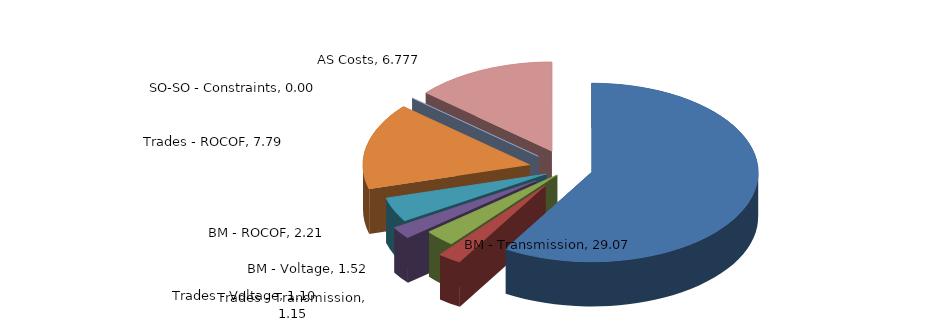
| Category | Series 0 |
|---|---|
| BM - Transmission | 29.065 |
| Trades - Transmission | 1.149 |
| BM - Voltage | 1.517 |
| Trades - Voltage | 1.096 |
| BM - ROCOF | 2.211 |
| Trades - ROCOF | 7.786 |
| SO-SO - Constraints | 0 |
| AS Costs | 6.777 |